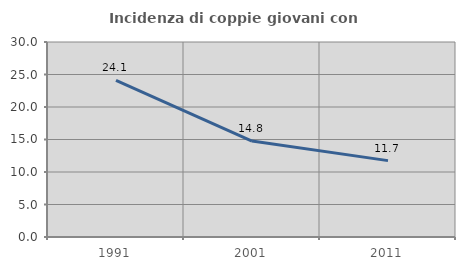
| Category | Incidenza di coppie giovani con figli |
|---|---|
| 1991.0 | 24.106 |
| 2001.0 | 14.76 |
| 2011.0 | 11.75 |